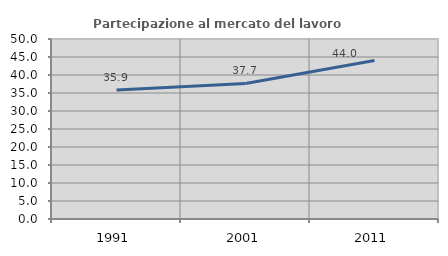
| Category | Partecipazione al mercato del lavoro  femminile |
|---|---|
| 1991.0 | 35.852 |
| 2001.0 | 37.658 |
| 2011.0 | 44.005 |